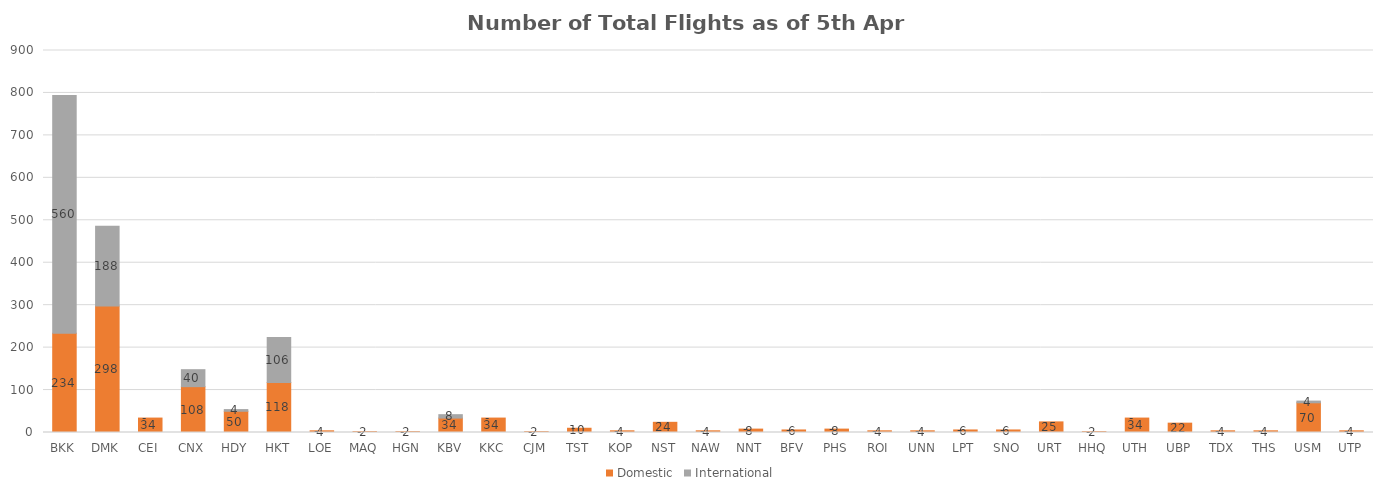
| Category | Domestic | International |
|---|---|---|
| BKK | 234 | 560 |
| DMK | 298 | 188 |
| CEI | 34 | 0 |
| CNX | 108 | 40 |
| HDY | 50 | 4 |
| HKT | 118 | 106 |
| LOE | 4 | 0 |
| MAQ | 2 | 0 |
| HGN | 2 | 0 |
| KBV | 34 | 8 |
| KKC | 34 | 0 |
| CJM | 2 | 0 |
| TST | 10 | 0 |
| KOP | 4 | 0 |
| NST | 24 | 0 |
| NAW | 4 | 0 |
| NNT | 8 | 0 |
| BFV | 6 | 0 |
| PHS | 8 | 0 |
| ROI | 4 | 0 |
| UNN | 4 | 0 |
| LPT | 6 | 0 |
| SNO | 6 | 0 |
| URT | 25 | 0 |
| HHQ | 2 | 0 |
| UTH | 34 | 0 |
| UBP | 22 | 0 |
| TDX | 4 | 0 |
| THS | 4 | 0 |
| USM | 70 | 4 |
| UTP | 4 | 0 |